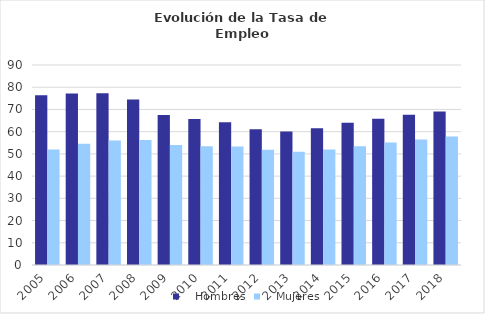
| Category |    Hombres |    Mujeres |
|---|---|---|
| 2005.0 | 76.38 | 51.92 |
| 2006.0 | 77.2 | 54.54 |
| 2007.0 | 77.26 | 56.05 |
| 2008.0 | 74.44 | 56.2 |
| 2009.0 | 67.47 | 54 |
| 2010.0 | 65.71 | 53.48 |
| 2011.0 | 64.21 | 53.29 |
| 2012.0 | 61.13 | 51.83 |
| 2013.0 | 60.08 | 51 |
| 2014.0 | 61.57 | 51.95 |
| 2015.0 | 63.96 | 53.44 |
| 2016.0 | 65.82 | 55.12 |
| 2017.0 | 67.58 | 56.52 |
| 2018.0 | 69.04 | 57.77 |